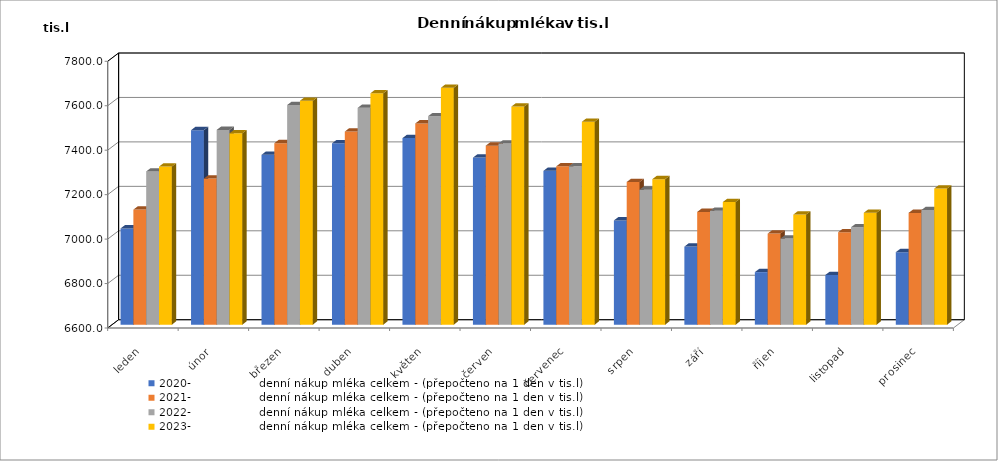
| Category | 2020-                 denní nákup mléka celkem - (přepočteno na 1 den v tis.l) | 2021-                 denní nákup mléka celkem - (přepočteno na 1 den v tis.l) | 2022-                 denní nákup mléka celkem - (přepočteno na 1 den v tis.l) | 2023-                 denní nákup mléka celkem - (přepočteno na 1 den v tis.l) |
|---|---|---|---|---|
| leden | 7033.097 | 7117.581 | 7289.355 | 7311.129 |
| únor | 7475.179 | 7257.25 | 7476.286 | 7460.7 |
| březen | 7364.29 | 7416.581 | 7588.065 | 7607.516 |
| duben | 7415.749 | 7469.033 | 7575.467 | 7641.267 |
| květen | 7439.452 | 7505.452 | 7537.935 | 7665.968 |
| červen | 7351.567 | 7405.5 | 7415.233 | 7581.3 |
| červenec | 7292.097 | 7312.419 | 7312.774 | 7512.871 |
| srpen | 7069.129 | 7241.871 | 7207.387 | 7254.677 |
| září | 6951.267 | 7107.267 | 7112.133 | 7151.767 |
| říjen | 6836.387 | 7009.774 | 6987.581 | 7095.226 |
| listopad | 6823.533 | 7015.9 | 7038.1 | 7103.5 |
| prosinec | 6926.161 | 7102.935 | 7115.903 | 7212.419 |